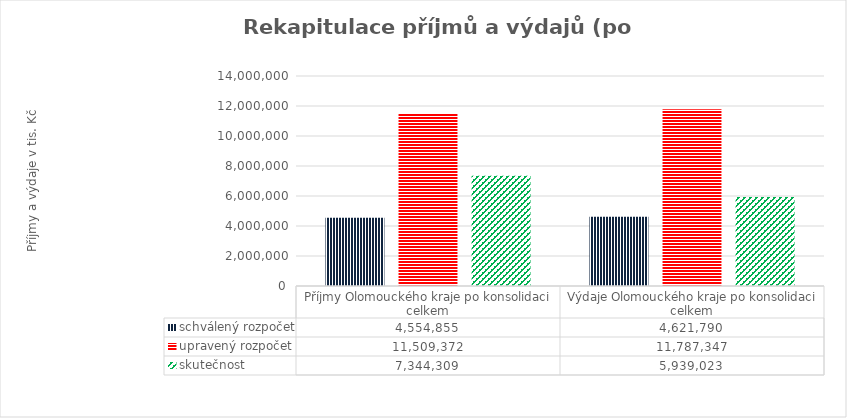
| Category | schválený rozpočet | upravený rozpočet | skutečnost |
|---|---|---|---|
| Příjmy Olomouckého kraje po konsolidaci celkem | 4554855 | 11509372 | 7344309 |
| Výdaje Olomouckého kraje po konsolidaci celkem | 4621790 | 11787347 | 5939023 |